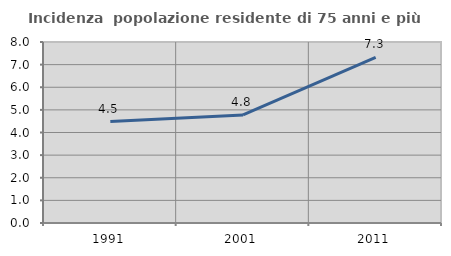
| Category | Incidenza  popolazione residente di 75 anni e più |
|---|---|
| 1991.0 | 4.482 |
| 2001.0 | 4.774 |
| 2011.0 | 7.322 |